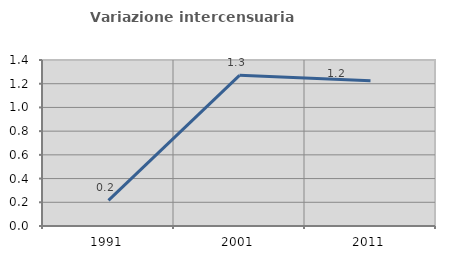
| Category | Variazione intercensuaria annua |
|---|---|
| 1991.0 | 0.217 |
| 2001.0 | 1.27 |
| 2011.0 | 1.224 |